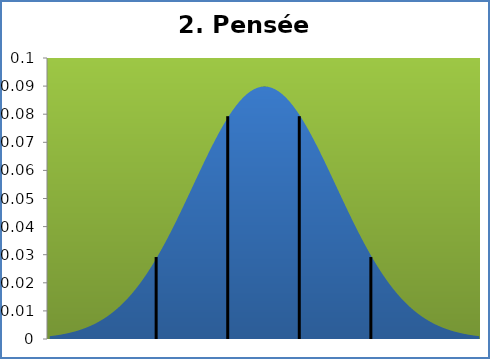
| Category | Series 1 |
|---|---|
| 5.399999999999997 | 0.001 |
| 5.621999999999996 | 0.001 |
| 5.843999999999998 | 0.001 |
| 6.065999999999999 | 0.002 |
| 6.2879999999999985 | 0.002 |
| 6.509999999999998 | 0.002 |
| 6.7319999999999975 | 0.002 |
| 6.953999999999997 | 0.003 |
| 7.175999999999998 | 0.003 |
| 7.397999999999998 | 0.003 |
| 7.619999999999997 | 0.004 |
| 7.841999999999997 | 0.004 |
| 8.063999999999998 | 0.005 |
| 8.285999999999998 | 0.006 |
| 8.508 | 0.006 |
| 8.729999999999999 | 0.007 |
| 8.951999999999998 | 0.008 |
| 9.173999999999998 | 0.009 |
| 9.395999999999997 | 0.01 |
| 9.617999999999999 | 0.011 |
| 9.839999999999998 | 0.012 |
| 10.061999999999998 | 0.013 |
| 10.283999999999997 | 0.015 |
| 10.505999999999998 | 0.016 |
| 10.727999999999998 | 0.018 |
| 10.95 | 0.019 |
| 11.171999999999999 | 0.021 |
| 11.393999999999998 | 0.023 |
| 11.615999999999998 | 0.025 |
| 11.837999999999997 | 0.027 |
| 12.059999999999999 | 0.029 |
| 12.281999999999998 | 0.031 |
| 12.503999999999998 | 0.034 |
| 12.725999999999999 | 0.036 |
| 12.947999999999999 | 0.039 |
| 13.169999999999998 | 0.041 |
| 13.392 | 0.044 |
| 13.613999999999999 | 0.046 |
| 13.835999999999999 | 0.049 |
| 14.057999999999998 | 0.052 |
| 14.279999999999998 | 0.054 |
| 14.501999999999999 | 0.057 |
| 14.723999999999998 | 0.06 |
| 14.945999999999998 | 0.063 |
| 15.168 | 0.065 |
| 15.389999999999999 | 0.068 |
| 15.611999999999998 | 0.07 |
| 15.834 | 0.073 |
| 16.055999999999997 | 0.075 |
| 16.278 | 0.077 |
| 16.5 | 0.079 |
| 16.721999999999998 | 0.081 |
| 16.944 | 0.083 |
| 17.166 | 0.085 |
| 17.387999999999998 | 0.086 |
| 17.61 | 0.087 |
| 17.831999999999997 | 0.088 |
| 18.054 | 0.089 |
| 18.276 | 0.089 |
| 18.497999999999998 | 0.09 |
| 18.72 | 0.09 |
| 18.942 | 0.09 |
| 19.163999999999998 | 0.089 |
| 19.386 | 0.089 |
| 19.608 | 0.088 |
| 19.83 | 0.087 |
| 20.052 | 0.086 |
| 20.273999999999997 | 0.085 |
| 20.496 | 0.083 |
| 20.718 | 0.081 |
| 20.939999999999998 | 0.079 |
| 21.162 | 0.077 |
| 21.384 | 0.075 |
| 21.605999999999998 | 0.073 |
| 21.828 | 0.07 |
| 22.05 | 0.068 |
| 22.272 | 0.065 |
| 22.494 | 0.063 |
| 22.715999999999998 | 0.06 |
| 22.938 | 0.057 |
| 23.16 | 0.054 |
| 23.381999999999998 | 0.052 |
| 23.604 | 0.049 |
| 23.826 | 0.046 |
| 24.048 | 0.044 |
| 24.27 | 0.041 |
| 24.491999999999997 | 0.039 |
| 24.714 | 0.036 |
| 24.936 | 0.034 |
| 25.158 | 0.031 |
| 25.38 | 0.029 |
| 25.602 | 0.027 |
| 25.823999999999998 | 0.025 |
| 26.046 | 0.023 |
| 26.268 | 0.021 |
| 26.49 | 0.019 |
| 26.712 | 0.018 |
| 26.933999999999997 | 0.016 |
| 27.156 | 0.015 |
| 27.378 | 0.013 |
| 27.6 | 0.012 |
| 27.822 | 0.011 |
| 28.044 | 0.01 |
| 28.266 | 0.009 |
| 28.488 | 0.008 |
| 28.71 | 0.007 |
| 28.932 | 0.006 |
| 29.154 | 0.006 |
| 29.375999999999998 | 0.005 |
| 29.598 | 0.004 |
| 29.82 | 0.004 |
| 30.042 | 0.003 |
| 30.264 | 0.003 |
| 30.486 | 0.003 |
| 30.708 | 0.002 |
| 30.93 | 0.002 |
| 31.152 | 0.002 |
| 31.374 | 0.002 |
| 31.596 | 0.001 |
| 31.818 | 0.001 |
| 32.04 | 0.001 |